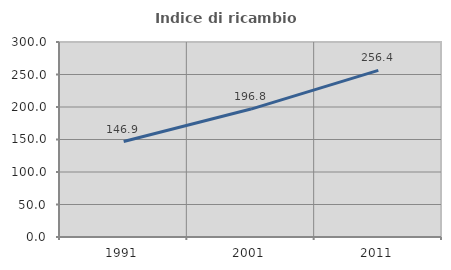
| Category | Indice di ricambio occupazionale  |
|---|---|
| 1991.0 | 146.858 |
| 2001.0 | 196.823 |
| 2011.0 | 256.387 |